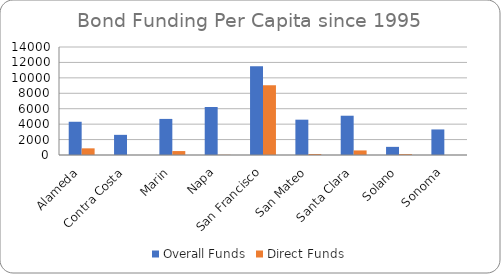
| Category | Overall Funds | Direct Funds |
|---|---|---|
| Alameda | 4309.068 | 863.879 |
| Contra Costa | 2612.894 | 0 |
| Marin | 4678.085 | 510.857 |
| Napa | 6220.647 | 26.784 |
| San Francisco | 11488.895 | 9032.291 |
| San Mateo | 4579.037 | 129.145 |
| Santa Clara | 5091.223 | 593.502 |
| Solano | 1055.097 | 115.829 |
| Sonoma | 3312.233 | 0 |